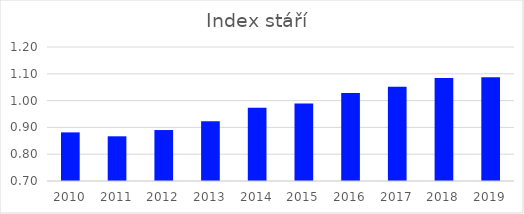
| Category | Index stáří  |
|---|---|
| 2010.0 | 0.881 |
| 2011.0 | 0.867 |
| 2012.0 | 0.89 |
| 2013.0 | 0.923 |
| 2014.0 | 0.973 |
| 2015.0 | 0.989 |
| 2016.0 | 1.029 |
| 2017.0 | 1.051 |
| 2018.0 | 1.084 |
| 2019.0 | 1.087 |